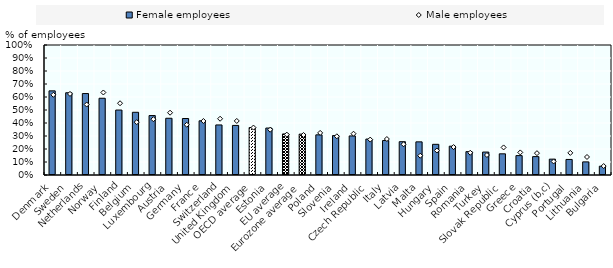
| Category | Female employees |
|---|---|
| Denmark | 0.647 |
| Sweden | 0.633 |
| Netherlands | 0.627 |
| Norway | 0.59 |
| Finland | 0.5 |
| Belgium | 0.482 |
| Luxembourg | 0.457 |
| Austria | 0.436 |
| Germany | 0.435 |
| France | 0.417 |
| Switzerland | 0.385 |
| United Kingdom | 0.381 |
| OECD average | 0.365 |
| Estonia | 0.361 |
| EU average | 0.316 |
| Eurozone average | 0.314 |
| Poland | 0.309 |
| Slovenia | 0.303 |
| Ireland | 0.301 |
| Czech Republic | 0.276 |
| Italy | 0.265 |
| Latvia | 0.256 |
| Malta | 0.255 |
| Hungary | 0.236 |
| Spain | 0.222 |
| Romania | 0.18 |
| Turkey | 0.176 |
| Slovak Republic | 0.163 |
| Greece | 0.149 |
| Croatia | 0.142 |
| Cyprus (b,c) | 0.122 |
| Portugal | 0.12 |
| Lithuania | 0.101 |
| Bulgaria | 0.068 |